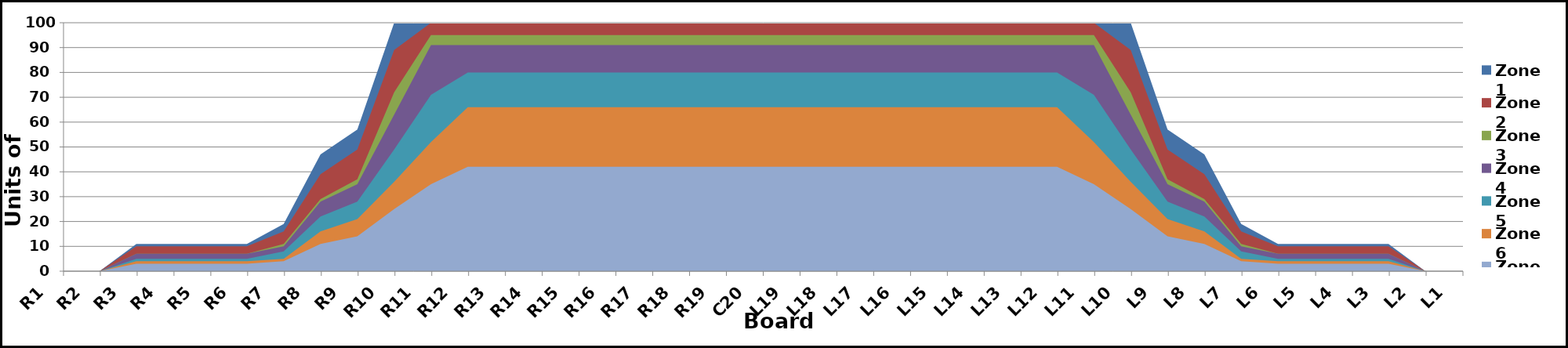
| Category | Zone 1 | Zone 2 | Zone 3 | Zone 4 | Zone 5 | Zone 6 | Zone 7 | Zone 8 |
|---|---|---|---|---|---|---|---|---|
| L1 | 0 | 0 | 0 | 0 | 0 | 0 | 0 | 0 |
| L2 | 0 | 0 | 0 | 0 | 0 | 0 | 0 | 0 |
| L3 | 11 | 10 | 7 | 7 | 5 | 4 | 3 | 0 |
| L4 | 11 | 10 | 7 | 7 | 5 | 4 | 3 | 0 |
| L5 | 11 | 10 | 7 | 7 | 5 | 4 | 3 | 0 |
| L6 | 11 | 10 | 7 | 7 | 5 | 4 | 3 | 0 |
| L7 | 19 | 16 | 11 | 10 | 8 | 5 | 4 | 0 |
| L8 | 47 | 39 | 29 | 28 | 22 | 16 | 11 | 0 |
| L9 | 57 | 49 | 37 | 35 | 28 | 21 | 14 | 0 |
| L10 | 100 | 89 | 72 | 63 | 49 | 36 | 25 | 0 |
| L11 | 100 | 100 | 95 | 91 | 71 | 52 | 35 | 0 |
| L12 | 100 | 100 | 95 | 91 | 80 | 66 | 42 | 0 |
| L13 | 100 | 100 | 95 | 91 | 80 | 66 | 42 | 0 |
| L14 | 100 | 100 | 95 | 91 | 80 | 66 | 42 | 0 |
| L15 | 100 | 100 | 95 | 91 | 80 | 66 | 42 | 0 |
| L16 | 100 | 100 | 95 | 91 | 80 | 66 | 42 | 0 |
| L17 | 100 | 100 | 95 | 91 | 80 | 66 | 42 | 0 |
| L18 | 100 | 100 | 95 | 91 | 80 | 66 | 42 | 0 |
| L19 | 100 | 100 | 95 | 91 | 80 | 66 | 42 | 0 |
| C20 | 100 | 100 | 95 | 91 | 80 | 66 | 42 | 0 |
| R19 | 100 | 100 | 95 | 91 | 80 | 66 | 42 | 0 |
| R18 | 100 | 100 | 95 | 91 | 80 | 66 | 42 | 0 |
| R17 | 100 | 100 | 95 | 91 | 80 | 66 | 42 | 0 |
| R16 | 100 | 100 | 95 | 91 | 80 | 66 | 42 | 0 |
| R15 | 100 | 100 | 95 | 91 | 80 | 66 | 42 | 0 |
| R14 | 100 | 100 | 95 | 91 | 80 | 66 | 42 | 0 |
| R13 | 100 | 100 | 95 | 91 | 80 | 66 | 42 | 0 |
| R12 | 100 | 100 | 95 | 91 | 80 | 66 | 42 | 0 |
| R11 | 100 | 100 | 95 | 91 | 71 | 52 | 35 | 0 |
| R10 | 100 | 89 | 72 | 63 | 49 | 36 | 25 | 0 |
| R9 | 57 | 49 | 37 | 35 | 28 | 21 | 14 | 0 |
| R8 | 47 | 39 | 29 | 28 | 22 | 16 | 11 | 0 |
| R7 | 19 | 16 | 11 | 10 | 8 | 5 | 4 | 0 |
| R6 | 11 | 10 | 7 | 7 | 5 | 4 | 3 | 0 |
| R5 | 11 | 10 | 7 | 7 | 5 | 4 | 3 | 0 |
| R4 | 11 | 10 | 7 | 7 | 5 | 4 | 3 | 0 |
| R3 | 11 | 10 | 7 | 7 | 5 | 4 | 3 | 0 |
| R2 | 0 | 0 | 0 | 0 | 0 | 0 | 0 | 0 |
| R1 | 0 | 0 | 0 | 0 | 0 | 0 | 0 | 0 |